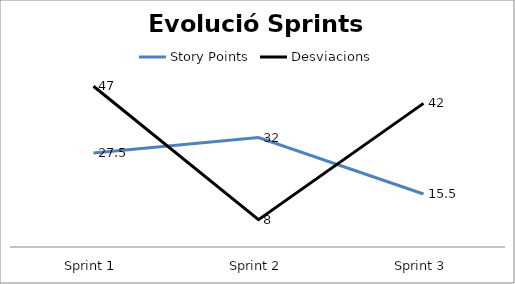
| Category | Story Points | Desviacions |
|---|---|---|
| Sprint 1 | 27.5 | 47 |
| Sprint 2 | 32 | 8 |
| Sprint 3 | 15.5 | 42 |